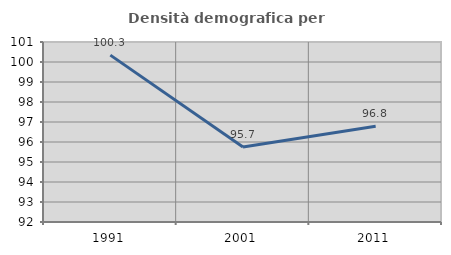
| Category | Densità demografica |
|---|---|
| 1991.0 | 100.343 |
| 2001.0 | 95.746 |
| 2011.0 | 96.785 |